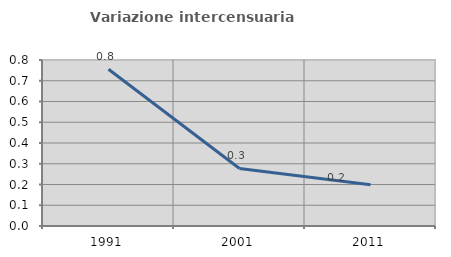
| Category | Variazione intercensuaria annua |
|---|---|
| 1991.0 | 0.756 |
| 2001.0 | 0.277 |
| 2011.0 | 0.199 |